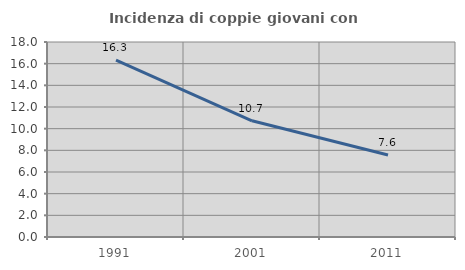
| Category | Incidenza di coppie giovani con figli |
|---|---|
| 1991.0 | 16.334 |
| 2001.0 | 10.724 |
| 2011.0 | 7.566 |